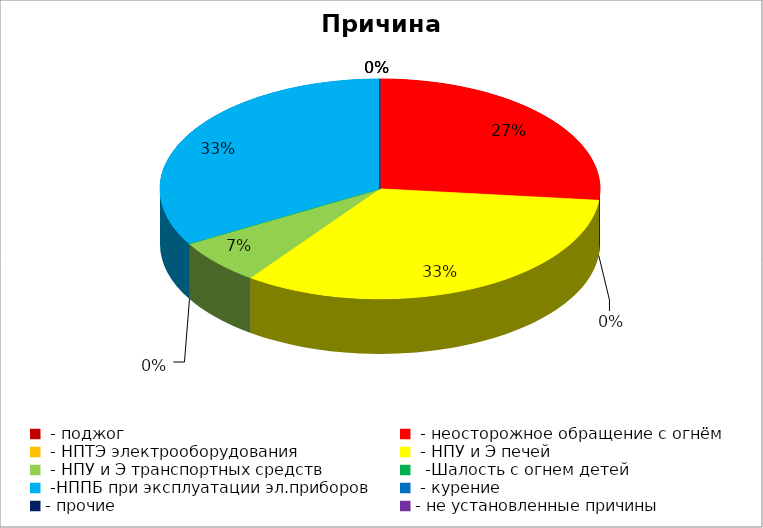
| Category | Причина пожара |
|---|---|
|  - поджог | 0 |
|  - неосторожное обращение с огнём | 4 |
|  - НПТЭ электрооборудования | 0 |
|  - НПУ и Э печей | 5 |
|  - НПУ и Э транспортных средств | 1 |
|   -Шалость с огнем детей | 0 |
|  -НППБ при эксплуатации эл.приборов | 5 |
|  - курение | 0 |
| - прочие | 0 |
| - не установленные причины | 0 |